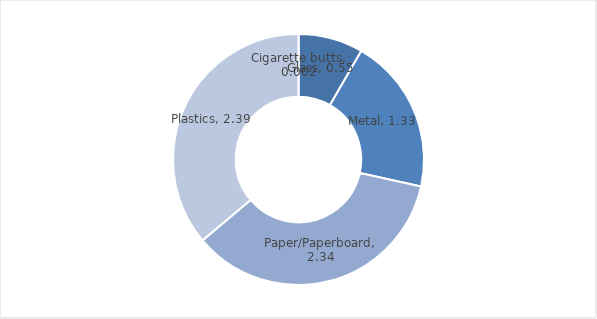
| Category | Series 0 |
|---|---|
| Cigarette butts | 0.002 |
| Glass | 0.55 |
| Metal | 1.33 |
| Paper/Paperboard | 2.34 |
| Plastics | 2.39 |